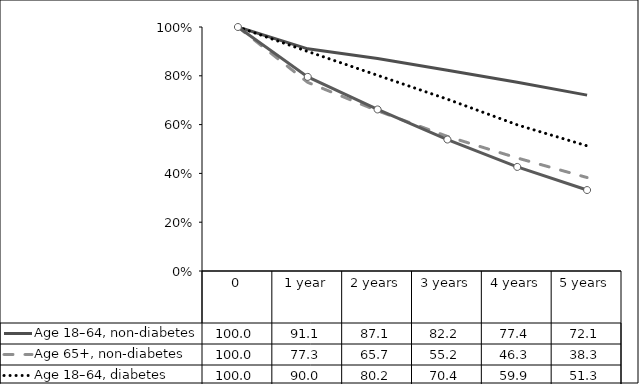
| Category | Age 18–64, non-diabetes | Age 65+, non-diabetes | Age 18–64, diabetes | Age 65+, diabetes |
|---|---|---|---|---|
| 0 | 100 | 100 | 100 | 100 |
| 1 year | 91.06 | 77.296 | 89.974 | 79.554 |
| 2 years | 87.072 | 65.652 | 80.196 | 66.207 |
| 3 years | 82.246 | 55.161 | 70.403 | 53.884 |
| 4 years | 77.366 | 46.318 | 59.902 | 42.653 |
| 5 years | 72.075 | 38.3 | 51.28 | 33.181 |